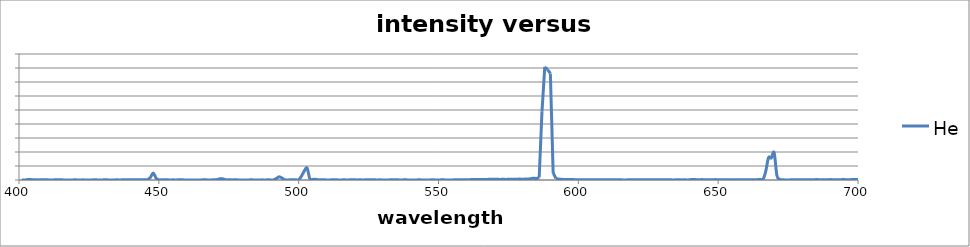
| Category | He |
|---|---|
| 401.0 | 3.83 |
| 402.0 | 0 |
| 403.0 | 14.69 |
| 404.0 | 18.91 |
| 405.0 | 6.96 |
| 406.0 | 6.13 |
| 407.0 | 4.3 |
| 408.0 | 7.51 |
| 409.0 | 8.09 |
| 410.0 | 9.29 |
| 411.0 | 0 |
| 412.0 | 1.99 |
| 413.0 | 6.61 |
| 414.0 | 6.57 |
| 415.0 | 8 |
| 416.0 | 3.04 |
| 417.0 | 1.15 |
| 418.0 | 3.67 |
| 419.0 | 1.28 |
| 420.0 | 8.49 |
| 421.0 | 1.48 |
| 422.0 | 2.62 |
| 423.0 | 4.87 |
| 424.0 | 0 |
| 425.0 | 3.89 |
| 426.0 | 1.92 |
| 427.0 | 10.96 |
| 428.0 | 3.1 |
| 429.0 | 0 |
| 430.0 | 4.11 |
| 431.0 | 7.1 |
| 432.0 | 3.2 |
| 433.0 | 4.02 |
| 434.0 | 0.77 |
| 435.0 | 6.86 |
| 436.0 | 1.18 |
| 437.0 | 7.23 |
| 438.0 | 6.95 |
| 439.0 | 9.06 |
| 440.0 | 12.27 |
| 441.0 | 9.62 |
| 442.0 | 7.98 |
| 443.0 | 6.93 |
| 444.0 | 4.47 |
| 445.0 | 7.12 |
| 446.0 | 11.93 |
| 447.0 | 92.76 |
| 448.0 | 251 |
| 449.0 | 71.29 |
| 450.0 | 8.39 |
| 451.0 | 6.05 |
| 452.0 | 4.88 |
| 453.0 | 7.39 |
| 454.0 | 0 |
| 455.0 | 5.71 |
| 456.0 | 2.42 |
| 457.0 | 6.98 |
| 458.0 | 8 |
| 459.0 | 4.13 |
| 460.0 | 3.26 |
| 461.0 | 4.38 |
| 462.0 | 0.85 |
| 463.0 | 4.43 |
| 464.0 | 0 |
| 465.0 | 1.59 |
| 466.0 | 9.06 |
| 467.0 | 6.55 |
| 468.0 | 0 |
| 469.0 | 5.55 |
| 470.0 | 9.3 |
| 471.0 | 18.12 |
| 472.0 | 46.62 |
| 473.0 | 39.32 |
| 474.0 | 7.2 |
| 475.0 | 6.88 |
| 476.0 | 4.33 |
| 477.0 | 4.99 |
| 478.0 | 5.13 |
| 479.0 | 0.67 |
| 480.0 | 3.19 |
| 481.0 | 3.06 |
| 482.0 | 2.14 |
| 483.0 | 7.59 |
| 484.0 | 2.76 |
| 485.0 | 2.31 |
| 486.0 | 2.86 |
| 487.0 | 4.57 |
| 488.0 | 2.74 |
| 489.0 | 5.19 |
| 490.0 | 3.99 |
| 491.0 | 3.1 |
| 492.0 | 51.94 |
| 493.0 | 113.27 |
| 494.0 | 72.61 |
| 495.0 | 9.53 |
| 496.0 | 1.23 |
| 497.0 | 8.9 |
| 498.0 | 4.9 |
| 499.0 | 6.01 |
| 500.0 | 6.95 |
| 501.0 | 137.92 |
| 502.0 | 321.29 |
| 503.0 | 428.08 |
| 504.0 | 39.15 |
| 505.0 | 21.49 |
| 506.0 | 23.95 |
| 507.0 | 9.42 |
| 508.0 | 13.06 |
| 509.0 | 8.5 |
| 510.0 | 3.27 |
| 511.0 | 1.83 |
| 512.0 | 8.24 |
| 513.0 | 11.17 |
| 514.0 | 3.95 |
| 515.0 | 0 |
| 516.0 | 7.22 |
| 517.0 | 3 |
| 518.0 | 4.42 |
| 519.0 | 8.3 |
| 520.0 | 8.13 |
| 521.0 | 3.01 |
| 522.0 | 8.56 |
| 523.0 | 0 |
| 524.0 | 9.46 |
| 525.0 | 5.4 |
| 526.0 | 4.84 |
| 527.0 | 8.63 |
| 528.0 | 0.86 |
| 529.0 | 6.57 |
| 530.0 | 0 |
| 531.0 | 3.54 |
| 532.0 | 2.72 |
| 533.0 | 6.78 |
| 534.0 | 6.15 |
| 535.0 | 6.65 |
| 536.0 | 3.69 |
| 537.0 | 3.65 |
| 538.0 | 7.42 |
| 539.0 | 3.04 |
| 540.0 | 0.76 |
| 541.0 | 0 |
| 542.0 | 3.62 |
| 543.0 | 4.89 |
| 544.0 | 4.01 |
| 545.0 | 1.35 |
| 546.0 | 0 |
| 547.0 | 3.41 |
| 548.0 | 8.55 |
| 549.0 | 0.21 |
| 550.0 | 0 |
| 551.0 | 6.4 |
| 552.0 | 4.99 |
| 553.0 | 0 |
| 554.0 | 1.15 |
| 555.0 | 4.16 |
| 556.0 | 4.92 |
| 557.0 | 7.05 |
| 558.0 | 4.19 |
| 559.0 | 6.86 |
| 560.0 | 12.35 |
| 561.0 | 13.16 |
| 562.0 | 14.03 |
| 563.0 | 18.71 |
| 564.0 | 19.1 |
| 565.0 | 17.37 |
| 566.0 | 20.29 |
| 567.0 | 17.01 |
| 568.0 | 24.93 |
| 569.0 | 25.04 |
| 570.0 | 24.65 |
| 571.0 | 24.91 |
| 572.0 | 20.91 |
| 573.0 | 27.65 |
| 574.0 | 19.98 |
| 575.0 | 26.6 |
| 576.0 | 26.64 |
| 577.0 | 26.95 |
| 578.0 | 28.65 |
| 579.0 | 32.71 |
| 580.0 | 27.88 |
| 581.0 | 32.73 |
| 582.0 | 35.07 |
| 583.0 | 47.15 |
| 584.0 | 65.02 |
| 585.0 | 53.89 |
| 586.0 | 88.78 |
| 587.0 | 2436.89 |
| 588.0 | 4037.6 |
| 589.0 | 3941.61 |
| 590.0 | 3805.11 |
| 591.0 | 251.75 |
| 592.0 | 55.29 |
| 593.0 | 30.7 |
| 594.0 | 24.33 |
| 595.0 | 19.04 |
| 596.0 | 15.11 |
| 597.0 | 13.89 |
| 598.0 | 18.96 |
| 599.0 | 9.64 |
| 600.0 | 8.36 |
| 601.0 | 6.12 |
| 602.0 | 10.52 |
| 603.0 | 11.86 |
| 604.0 | 8.82 |
| 605.0 | 10.4 |
| 606.0 | 8.53 |
| 607.0 | 9.74 |
| 608.0 | 7.09 |
| 609.0 | 5.74 |
| 610.0 | 11.3 |
| 611.0 | 8.11 |
| 612.0 | 8.29 |
| 613.0 | 5.38 |
| 614.0 | 5.92 |
| 615.0 | 8.44 |
| 616.0 | 2.95 |
| 617.0 | 1.66 |
| 618.0 | 10.79 |
| 619.0 | 7.05 |
| 620.0 | 5.44 |
| 621.0 | 7.13 |
| 622.0 | 11.24 |
| 623.0 | 9.25 |
| 624.0 | 5.79 |
| 625.0 | 10.01 |
| 626.0 | 6.05 |
| 627.0 | 7.8 |
| 628.0 | 4.89 |
| 629.0 | 7.43 |
| 630.0 | 5.9 |
| 631.0 | 9.42 |
| 632.0 | 6.17 |
| 633.0 | 10.75 |
| 634.0 | 0 |
| 635.0 | 8.68 |
| 636.0 | 5.83 |
| 637.0 | 4.34 |
| 638.0 | 8.83 |
| 639.0 | 0.17 |
| 640.0 | 12.97 |
| 641.0 | 18.1 |
| 642.0 | 13.37 |
| 643.0 | 7.94 |
| 644.0 | 13.93 |
| 645.0 | 11.49 |
| 646.0 | 9.1 |
| 647.0 | 8.41 |
| 648.0 | 10.9 |
| 649.0 | 13.89 |
| 650.0 | 9.52 |
| 651.0 | 7.27 |
| 652.0 | 10 |
| 653.0 | 11.01 |
| 654.0 | 4.4 |
| 655.0 | 8.97 |
| 656.0 | 7.36 |
| 657.0 | 10.26 |
| 658.0 | 12.26 |
| 659.0 | 10.61 |
| 660.0 | 9.77 |
| 661.0 | 10.8 |
| 662.0 | 7.87 |
| 663.0 | 10.83 |
| 664.0 | 12.58 |
| 665.0 | 22.52 |
| 666.0 | 16.66 |
| 667.0 | 303.94 |
| 668.0 | 799.54 |
| 669.0 | 784.96 |
| 670.0 | 979.79 |
| 671.0 | 163.35 |
| 672.0 | 27.55 |
| 673.0 | 11.71 |
| 674.0 | 2.09 |
| 675.0 | 1.87 |
| 676.0 | 5.61 |
| 677.0 | 5.12 |
| 678.0 | 9.85 |
| 679.0 | 5.85 |
| 680.0 | 4.71 |
| 681.0 | 10.19 |
| 682.0 | 8.38 |
| 683.0 | 9.47 |
| 684.0 | 6.81 |
| 685.0 | 14.48 |
| 686.0 | 11.67 |
| 687.0 | 4.3 |
| 688.0 | 12.43 |
| 689.0 | 9.86 |
| 690.0 | 14 |
| 691.0 | 11.86 |
| 692.0 | 7.73 |
| 693.0 | 12.47 |
| 694.0 | 12.93 |
| 695.0 | 16.91 |
| 696.0 | 8.69 |
| 697.0 | 11.94 |
| 698.0 | 14.48 |
| 699.0 | 15.05 |
| 700.0 | 15.09 |